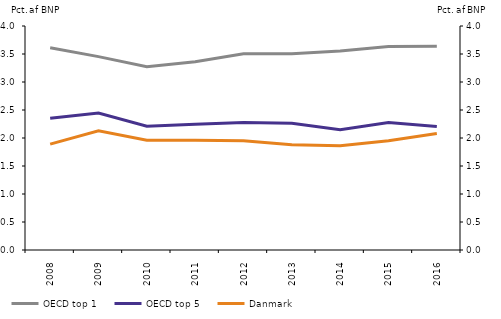
| Category | OECD top 1 | OECD top 5 | Danmark |
|---|---|---|---|
| 2008.0 | 3.61 | 2.354 | 1.89 |
| 2009.0 | 3.453 | 2.446 | 2.13 |
| 2010.0 | 3.272 | 2.211 | 1.96 |
| 2011.0 | 3.362 | 2.244 | 1.96 |
| 2012.0 | 3.504 | 2.279 | 1.95 |
| 2013.0 | 3.503 | 2.263 | 1.88 |
| 2014.0 | 3.554 | 2.146 | 1.86 |
| 2015.0 | 3.632 | 2.276 | 1.95 |
| 2016.0 | 3.638 | 2.205 | 2.08 |